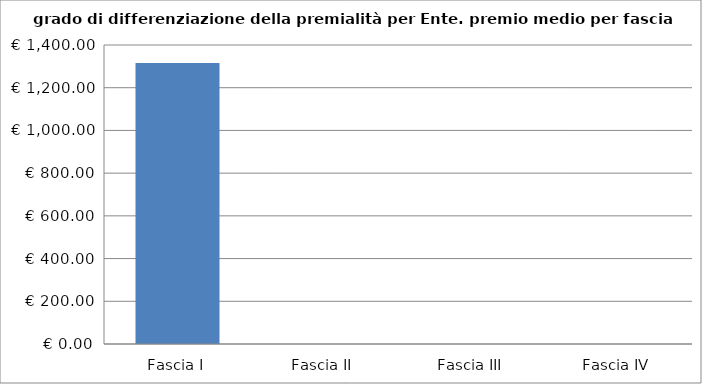
| Category | Totale ente |
|---|---|
| Fascia I | 1315.187 |
| Fascia II | 0 |
| Fascia III | 0 |
| Fascia IV | 0 |